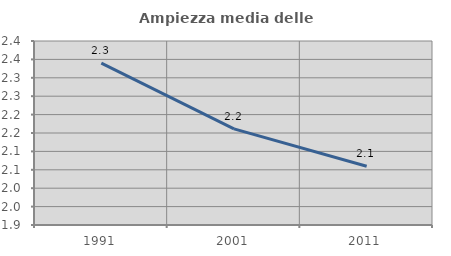
| Category | Ampiezza media delle famiglie |
|---|---|
| 1991.0 | 2.34 |
| 2001.0 | 2.161 |
| 2011.0 | 2.06 |